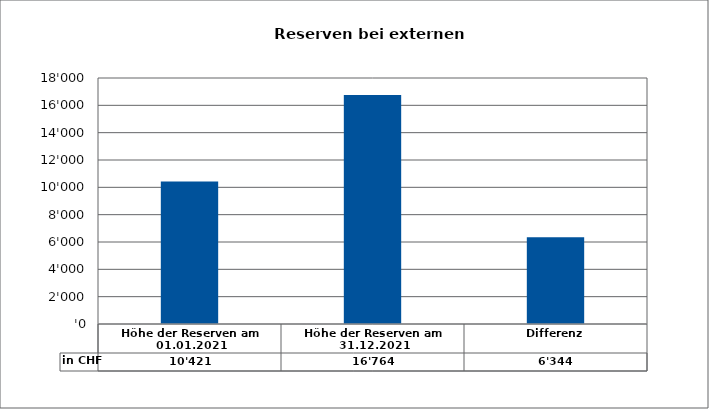
| Category | in CHF |
|---|---|
| Höhe der Reserven am 01.01.2021 | 10420.64 |
| Höhe der Reserven am 31.12.2021 | 16764.36 |
| Differenz | 6343.72 |